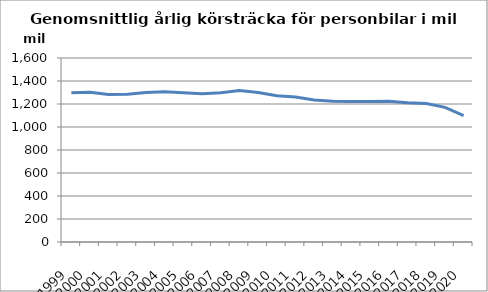
| Category | Series 0 |
|---|---|
| 1999.0 | 1297.356 |
| 2000.0 | 1302.123 |
| 2001.0 | 1282.789 |
| 2002.0 | 1284.262 |
| 2003.0 | 1300.096 |
| 2004.0 | 1306.096 |
| 2005.0 | 1297.872 |
| 2006.0 | 1289.576 |
| 2007.0 | 1298.448 |
| 2008.0 | 1317.396 |
| 2009.0 | 1299.235 |
| 2010.0 | 1270.911 |
| 2011.0 | 1260.065 |
| 2012.0 | 1235.288 |
| 2013.0 | 1222.991 |
| 2014.0 | 1221.821 |
| 2015.0 | 1221.564 |
| 2016.0 | 1224.04 |
| 2017.0 | 1211.43 |
| 2018.0 | 1204.247 |
| 2019.0 | 1171.085 |
| 2020.0 | 1099.946 |